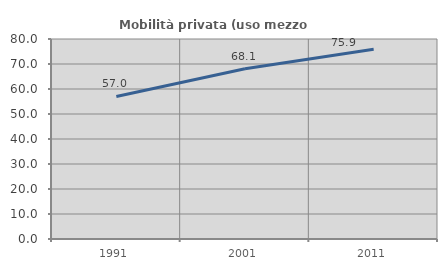
| Category | Mobilità privata (uso mezzo privato) |
|---|---|
| 1991.0 | 57.023 |
| 2001.0 | 68.11 |
| 2011.0 | 75.874 |